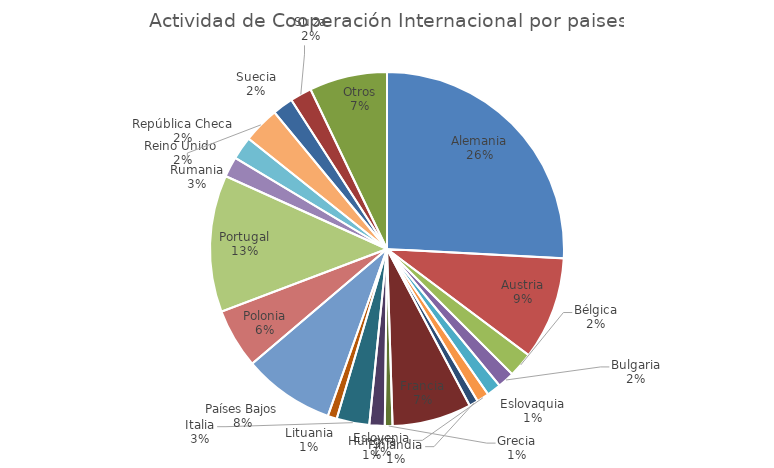
| Category | Nº DE EXPEDIENTES |
|---|---|
| Alemania | 1955 |
| Austria | 711 |
| Bélgica | 171 |
| Bulgaria | 116 |
| Eslovaquia | 98 |
| Eslovenia | 85 |
| Finlandia | 62 |
| Francia | 547 |
| Grecia | 53 |
| Hungría | 106 |
| Italia | 226 |
| Lituania | 63 |
| Países Bajos | 633 |
| Polonia | 413 |
| Portugal | 946 |
| Reino Unido  | 140 |
| República Checa | 160 |
| Rumania | 251 |
| Suecia | 143 |
| Suiza | 149 |
| Otros | 538 |